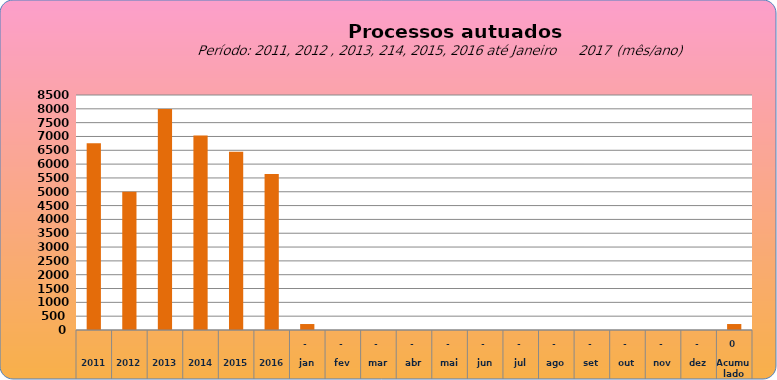
| Category | 6755 |
|---|---|
| 2011 | 6755 |
| 2012 | 4997 |
| 2013 | 7990 |
| 2014 | 7034 |
| 2015 | 6446 |
| 2016 | 5644 |
| jan | 216 |
| fev | 0 |
| mar | 0 |
| abr | 0 |
| mai | 0 |
| jun | 0 |
| jul | 0 |
| ago | 0 |
| set | 0 |
| out | 0 |
| nov | 0 |
| dez | 0 |
| Acumulado
 | 216 |